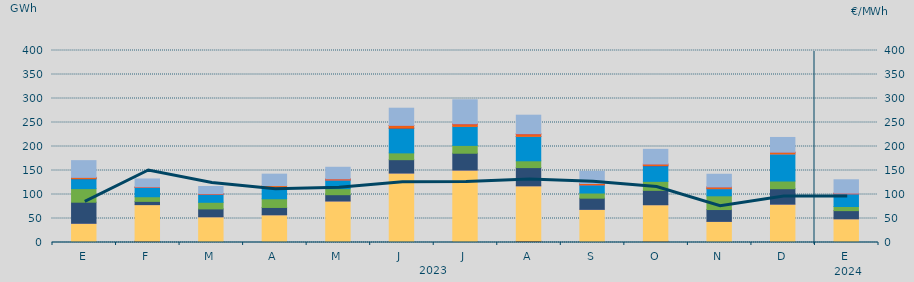
| Category | Carbón | Ciclo Combinado | Cogeneración | Consumo Bombeo | Eólica | Hidráulica | Nuclear | Otras Renovables | Solar fotovoltaica | Solar térmica | Turbinación bombeo |
|---|---|---|---|---|---|---|---|---|---|---|---|
| E | 478.95 | 39560.875 | 26.867 | 43909.242 | 28275.092 | 20601.292 | 143.6 | 0 | 2603.242 | 1.5 | 34937.333 |
| F | 2850.925 | 76083.275 | 1.55 | 6739.65 | 9661.175 | 19240.1 | 0 | 0 | 962.675 | 47.25 | 16781.025 |
| M | 1195.025 | 52392.533 | 3.3 | 16393.158 | 13789.6 | 16980.517 | 40.625 | 4.5 | 911.6 | 43.15 | 14940.475 |
| A | 218.875 | 57485.65 | 46.225 | 15258.175 | 18096.25 | 24086.65 | 63.45 | 0 | 3316.075 | 0 | 23819.559 |
| M | 150.482 | 86315.465 | 30 | 13099.874 | 12607.441 | 17784.926 | 256.325 | 2 | 2256.963 | 1.5 | 24199.004 |
| J | 1968.975 | 142738.351 | 35.225 | 27797.375 | 14167.175 | 51399.925 | 228.125 | 0 | 5290.65 | 319.5 | 35835.25 |
| J | 1606.69 | 149175.946 | 137.975 | 35048.925 | 16290.2 | 39637.497 | 0 | 5 | 4774.95 | 398.125 | 50276.3 |
| A | 2991.569 | 115032.711 | 108.25 | 37912.341 | 14171.547 | 50649.252 | 261.175 | 69.9 | 4696.2 | 414.625 | 38918.209 |
| S | 1098.882 | 67978.9 | 0.25 | 23304.2 | 10673.95 | 16895.894 | 188.6 | 32.7 | 2616.325 | 77.25 | 25361.951 |
| O | 2715.032 | 75984.499 | 16.5 | 29926.75 | 18741.87 | 32145.415 | 710.65 | 39.9 | 2928.133 | 55.25 | 30795.542 |
| N | 172.117 | 43840.328 | 7.5 | 24632.584 | 28628.29 | 14889.19 | 70.15 | 31.25 | 3231.232 | 0.75 | 26664.945 |
| D | 377.1 | 79511.116 | 46.675 | 32172.6 | 15961.085 | 56456.754 | 0 | 3.25 | 3449.06 | 1 | 30839.05 |
| E | 523.65 | 48869.214 | 27.508 | 16987.325 | 8593.466 | 26383.8 | 129.175 | 1.5 | 1107.758 | 1 | 28037.622 |